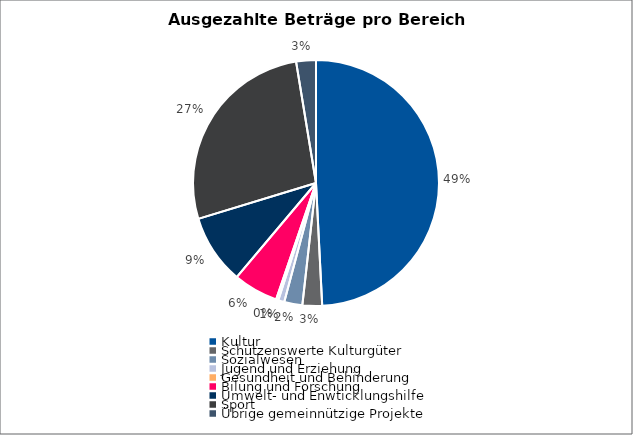
| Category | Series 0 |
|---|---|
| Kultur | 20465000 |
| Schützenswerte Kulturgüter | 1072000 |
| Sozialwesen | 988000 |
| Jugend und Erziehung | 336000 |
| Gesundheit und Behinderung | 124000 |
| Bilung und Forschung | 2452000 |
| Umwelt- und Enwticklungshilfe | 3804000 |
| Sport | 11281000 |
| Übrige gemeinnützige Projekte | 1078000 |